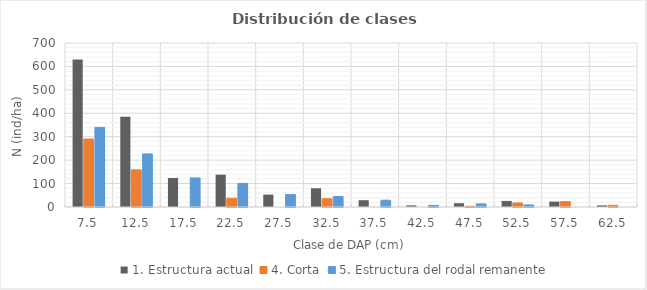
| Category | 1. Estructura actual | 4. Corta | 5. Estructura del rodal remanente |
|---|---|---|---|
| 7.5 | 630 | 290.14 | 339.86 |
| 12.5 | 385 | 158.427 | 226.573 |
| 17.5 | 124 | 0 | 124 |
| 22.5 | 138 | 37.301 | 100.699 |
| 27.5 | 53 | 0 | 53 |
| 32.5 | 80 | 35.245 | 44.755 |
| 37.5 | 29 | 0 | 29 |
| 42.5 | 7 | 0 | 7 |
| 47.5 | 16 | 2.739 | 13.261 |
| 52.5 | 26 | 17.159 | 8.841 |
| 57.5 | 23 | 23 | 0 |
| 62.5 | 7 | 7 | 0 |